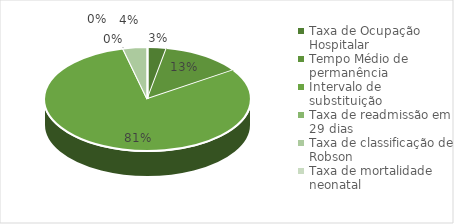
| Category | Series 0 |
|---|---|
| Taxa de Ocupação Hospitalar | 0.79 |
| Tempo Médio de permanência | 3.35 |
| Intervalo de substituição | 21.35 |
| Taxa de readmissão em 29 dias | 0.008 |
| Taxa de classificação de Robson | 1 |
| Taxa de mortalidade neonatal | 0 |